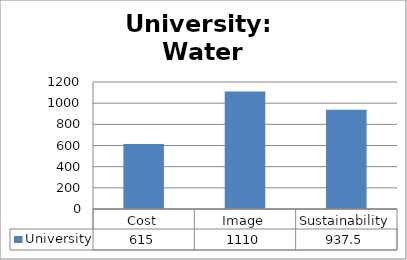
| Category | University |
|---|---|
| Cost | 615 |
| Image | 1110 |
| Sustainability | 937.5 |